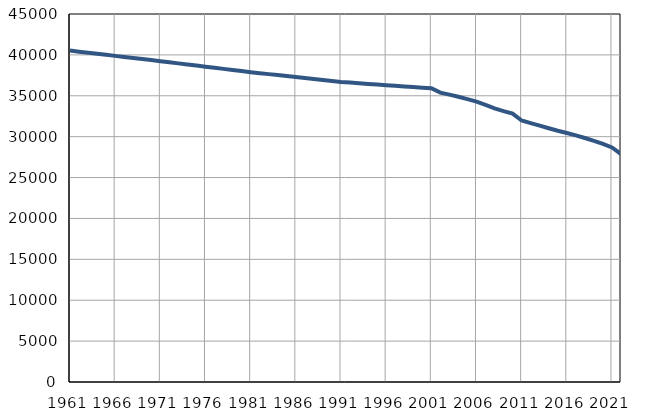
| Category | Population
size |
|---|---|
| 1961.0 | 40526 |
| 1962.0 | 40397 |
| 1963.0 | 40268 |
| 1964.0 | 40138 |
| 1965.0 | 40009 |
| 1966.0 | 39880 |
| 1967.0 | 39750 |
| 1968.0 | 39621 |
| 1969.0 | 39492 |
| 1970.0 | 39362 |
| 1971.0 | 39233 |
| 1972.0 | 39098 |
| 1973.0 | 38964 |
| 1974.0 | 38829 |
| 1975.0 | 38695 |
| 1976.0 | 38560 |
| 1977.0 | 38425 |
| 1978.0 | 38291 |
| 1979.0 | 38156 |
| 1980.0 | 38022 |
| 1981.0 | 37887 |
| 1982.0 | 37767 |
| 1983.0 | 37647 |
| 1984.0 | 37527 |
| 1985.0 | 37407 |
| 1986.0 | 37287 |
| 1987.0 | 37166 |
| 1988.0 | 37046 |
| 1989.0 | 36926 |
| 1990.0 | 36807 |
| 1991.0 | 36686 |
| 1992.0 | 36609 |
| 1993.0 | 36531 |
| 1994.0 | 36454 |
| 1995.0 | 36377 |
| 1996.0 | 36299 |
| 1997.0 | 36222 |
| 1998.0 | 36144 |
| 1999.0 | 36067 |
| 2000.0 | 35990 |
| 2001.0 | 35912 |
| 2002.0 | 35381 |
| 2003.0 | 35141 |
| 2004.0 | 34876 |
| 2005.0 | 34594 |
| 2006.0 | 34279 |
| 2007.0 | 33878 |
| 2008.0 | 33466 |
| 2009.0 | 33132 |
| 2010.0 | 32825 |
| 2011.0 | 31980 |
| 2012.0 | 31658 |
| 2013.0 | 31347 |
| 2014.0 | 31033 |
| 2015.0 | 30718 |
| 2016.0 | 30449 |
| 2017.0 | 30161 |
| 2018.0 | 29832 |
| 2019.0 | 29490 |
| 2020.0 | 29115 |
| 2021.0 | 28685 |
| 2022.0 | 27870 |